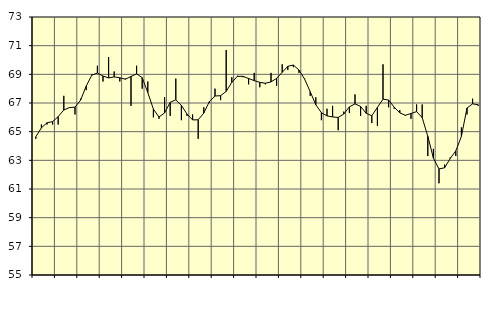
| Category | Piggar | Series 1 |
|---|---|---|
| nan | 64.5 | 64.64 |
| 1.0 | 65.5 | 65.27 |
| 1.0 | 65.5 | 65.62 |
| 1.0 | 65.5 | 65.7 |
| nan | 65.5 | 66.05 |
| 2.0 | 67.5 | 66.51 |
| 2.0 | 66.7 | 66.68 |
| 2.0 | 66.2 | 66.71 |
| nan | 67.3 | 67.2 |
| 3.0 | 67.9 | 68.18 |
| 3.0 | 69 | 68.94 |
| 3.0 | 69.6 | 69.09 |
| nan | 68.5 | 68.88 |
| 4.0 | 70.2 | 68.75 |
| 4.0 | 69.2 | 68.82 |
| 4.0 | 68.5 | 68.76 |
| nan | 68.7 | 68.66 |
| 5.0 | 66.8 | 68.85 |
| 5.0 | 69.6 | 69.03 |
| 5.0 | 68 | 68.77 |
| nan | 68.5 | 67.73 |
| 6.0 | 66 | 66.57 |
| 6.0 | 65.9 | 66.02 |
| 6.0 | 67.4 | 66.31 |
| nan | 66.1 | 67.05 |
| 7.0 | 68.7 | 67.22 |
| 7.0 | 65.8 | 66.83 |
| 7.0 | 66.1 | 66.23 |
| nan | 66.2 | 65.82 |
| 8.0 | 64.5 | 65.83 |
| 8.0 | 66.7 | 66.3 |
| 8.0 | 67 | 67.1 |
| nan | 68 | 67.49 |
| 9.0 | 67.2 | 67.51 |
| 9.0 | 70.7 | 67.81 |
| 9.0 | 68.8 | 68.44 |
| nan | 68.9 | 68.86 |
| 10.0 | 68.8 | 68.86 |
| 10.0 | 68.3 | 68.71 |
| 10.0 | 69.1 | 68.56 |
| nan | 68.1 | 68.44 |
| 11.0 | 68.3 | 68.38 |
| 11.0 | 69.1 | 68.47 |
| 11.0 | 68.2 | 68.72 |
| nan | 69.7 | 69.14 |
| 12.0 | 69.3 | 69.56 |
| 12.0 | 69.5 | 69.65 |
| 12.0 | 69.1 | 69.3 |
| nan | 68.7 | 68.67 |
| 13.0 | 67.5 | 67.79 |
| 13.0 | 67.4 | 66.88 |
| 13.0 | 65.8 | 66.32 |
| nan | 66.6 | 66.1 |
| 14.0 | 66.8 | 66.03 |
| 14.0 | 65.1 | 65.99 |
| 14.0 | 66.4 | 66.23 |
| nan | 66.3 | 66.73 |
| 15.0 | 67.6 | 66.94 |
| 15.0 | 66.1 | 66.76 |
| 15.0 | 66.8 | 66.28 |
| nan | 65.6 | 66.11 |
| 16.0 | 65.4 | 66.69 |
| 16.0 | 69.7 | 67.27 |
| 16.0 | 66.7 | 67.21 |
| nan | 66.6 | 66.71 |
| 17.0 | 66.5 | 66.31 |
| 17.0 | 66.1 | 66.14 |
| 17.0 | 65.9 | 66.27 |
| nan | 66.9 | 66.4 |
| 18.0 | 66.9 | 65.98 |
| 18.0 | 63.3 | 64.68 |
| 18.0 | 63.8 | 63.15 |
| nan | 61.4 | 62.4 |
| 19.0 | 62.7 | 62.48 |
| 19.0 | 63.2 | 63.13 |
| 19.0 | 63.3 | 63.66 |
| nan | 65.3 | 64.67 |
| 20.0 | 66.2 | 66.65 |
| 20.0 | 67.3 | 66.94 |
| 20.0 | 66.8 | 66.88 |